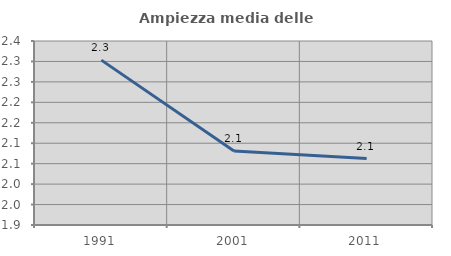
| Category | Ampiezza media delle famiglie |
|---|---|
| 1991.0 | 2.303 |
| 2001.0 | 2.081 |
| 2011.0 | 2.063 |